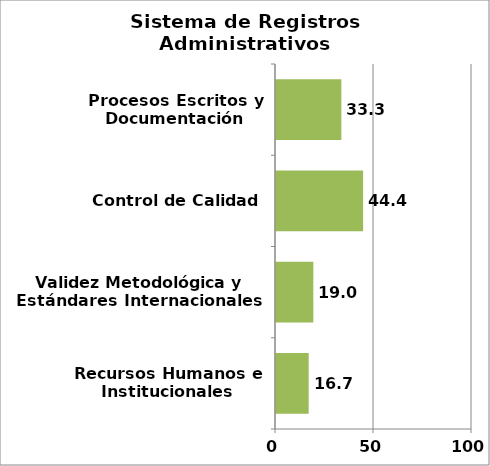
| Category | Series 0 |
|---|---|
| Recursos Humanos e Institucionales | 16.667 |
| Validez Metodológica y Estándares Internacionales | 19.048 |
| Control de Calidad | 44.444 |
| Procesos Escritos y Documentación | 33.333 |